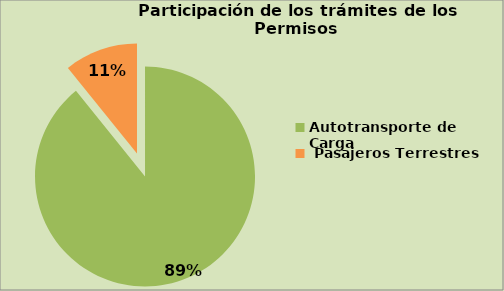
| Category | Series 0 |
|---|---|
| Autotransporte de Carga  | 89.194 |
|  Pasajeros Terrestres | 10.806 |